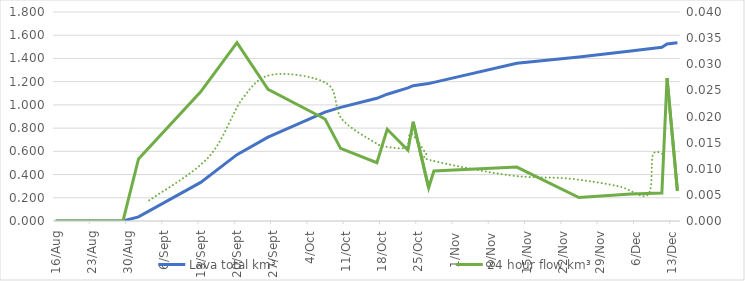
| Category | Lava total km³ |
|---|---|
| 2014-08-16 | 0 |
| 2014-08-29 | 0 |
| 2014-09-01 | 0.036 |
| 2014-09-13 | 0.332 |
| 2014-09-20 | 0.571 |
| 2014-09-26 | 0.722 |
| 2014-10-07 | 0.937 |
| 2014-10-10 | 0.979 |
| 2014-10-17 | 1.057 |
| 2014-10-19 | 1.092 |
| 2014-10-23 | 1.146 |
| 2014-10-24 | 1.165 |
| 2014-10-27 | 1.184 |
| 2014-10-28 | 1.194 |
| 2014-11-13 | 1.359 |
| 2014-11-25 | 1.413 |
| 2014-12-05 | 1.464 |
| 2014-12-11 | 1.497 |
| 2014-12-12 | 1.524 |
| 2014-12-14 | 1.535 |